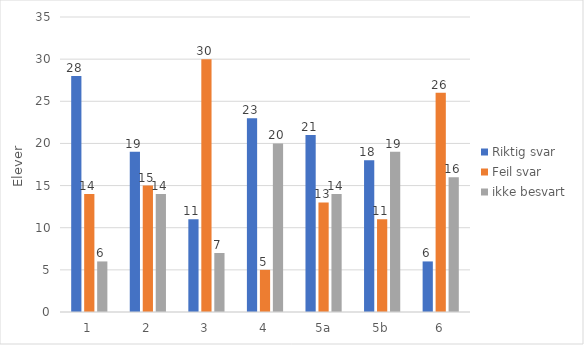
| Category | Riktig svar | Feil svar | ikke besvart |
|---|---|---|---|
| 1 | 28 | 14 | 6 |
| 2 | 19 | 15 | 14 |
| 3 | 11 | 30 | 7 |
| 4 | 23 | 5 | 20 |
| 5a | 21 | 13 | 14 |
| 5b | 18 | 11 | 19 |
| 6 | 6 | 26 | 16 |